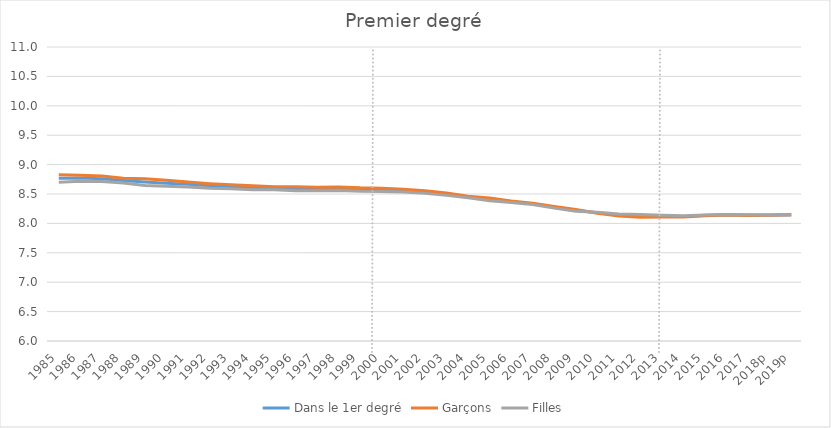
| Category | Dans le 1er degré | Garçons | Filles |
|---|---|---|---|
| 1985 | 8.767 | 8.827 | 8.702 |
| 1986 | 8.772 | 8.818 | 8.715 |
| 1987 | 8.761 | 8.807 | 8.711 |
| 1988 | 8.73 | 8.769 | 8.686 |
| 1989 | 8.705 | 8.758 | 8.646 |
| 1990 | 8.684 | 8.733 | 8.633 |
| 1991 | 8.665 | 8.703 | 8.619 |
| 1992 | 8.639 | 8.676 | 8.597 |
| 1993 | 8.623 | 8.656 | 8.588 |
| 1994 | 8.608 | 8.642 | 8.573 |
| 1995 | 8.598 | 8.623 | 8.571 |
| 1996 | 8.591 | 8.623 | 8.556 |
| 1997 | 8.587 | 8.615 | 8.554 |
| 1998 | 8.592 | 8.621 | 8.56 |
| 1999 | 8.578 | 8.604 | 8.545 |
| 2000 | 8.573 | 8.6 | 8.541 |
| 2001 | 8.56 | 8.579 | 8.534 |
| 2002 | 8.533 | 8.554 | 8.511 |
| 2003 | 8.498 | 8.517 | 8.477 |
| 2004 | 8.451 | 8.463 | 8.434 |
| 2005 | 8.411 | 8.43 | 8.386 |
| 2006 | 8.368 | 8.381 | 8.355 |
| 2007 | 8.332 | 8.342 | 8.32 |
| 2008 | 8.274 | 8.287 | 8.259 |
| 2009 | 8.222 | 8.237 | 8.206 |
| 2010 | 8.18 | 8.172 | 8.188 |
| 2011 | 8.141 | 8.124 | 8.159 |
| 2012 | 8.126 | 8.103 | 8.15 |
| 2013 | 8.123 | 8.107 | 8.14 |
| 2014 | 8.118 | 8.107 | 8.129 |
| 2015 | 8.139 | 8.132 | 8.145 |
| 2016 | 8.147 | 8.141 | 8.151 |
| 2017 | 8.143 | 8.136 | 8.147 |
| 2018p | 8.144 | 8.139 | 8.143 |
| 2019p | 8.148 | 8.147 | 8.144 |